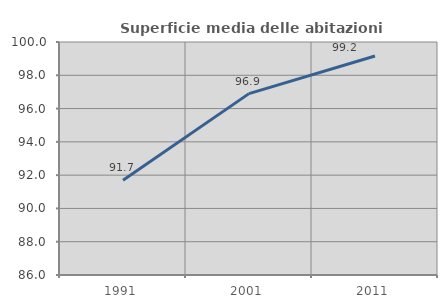
| Category | Superficie media delle abitazioni occupate |
|---|---|
| 1991.0 | 91.697 |
| 2001.0 | 96.899 |
| 2011.0 | 99.16 |